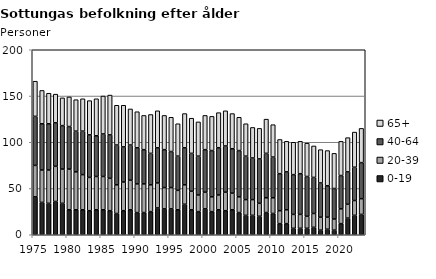
| Category | 0-19 | 20-39 | 40-64 | 65+ |
|---|---|---|---|---|
| 1975.0 | 41 | 34 | 53 | 38 |
| 1976.0 | 35 | 35 | 50 | 36 |
| 1977.0 | 34 | 36 | 50 | 33 |
| 1978.0 | 36 | 38 | 47 | 31 |
| 1979.0 | 34 | 37 | 47 | 30 |
| 1980.0 | 27 | 44 | 46 | 32 |
| 1981.0 | 27 | 41 | 44 | 34 |
| 1982.0 | 27 | 38 | 47 | 35 |
| 1983.0 | 26 | 36 | 46 | 37 |
| 1984.0 | 27 | 36 | 44 | 40 |
| 1985.0 | 27 | 36 | 46 | 41 |
| 1986.0 | 26 | 35 | 47 | 43 |
| 1987.0 | 23 | 31 | 43 | 43 |
| 1988.0 | 26 | 31 | 38 | 45 |
| 1989.0 | 27 | 32 | 38 | 39 |
| 1990.0 | 24 | 31 | 39 | 39 |
| 1991.0 | 24 | 31 | 37 | 37 |
| 1992.0 | 25 | 29 | 34 | 42 |
| 1993.0 | 29 | 27 | 38 | 40 |
| 1994.0 | 28 | 23 | 41 | 37 |
| 1995.0 | 28 | 23 | 39 | 37 |
| 1996.0 | 27 | 21 | 37 | 35 |
| 1997.0 | 33 | 21 | 40 | 37 |
| 1998.0 | 27 | 20 | 41 | 38 |
| 1999.0 | 25 | 18 | 42 | 37 |
| 2000.0 | 28 | 18 | 46 | 37 |
| 2001.0 | 25 | 16 | 50 | 37 |
| 2002.0 | 27 | 16 | 51 | 38 |
| 2003.0 | 26 | 20 | 50 | 38 |
| 2004.0 | 27 | 18 | 48 | 38 |
| 2005.0 | 24 | 17 | 50 | 36 |
| 2006.0 | 21 | 17 | 47 | 35 |
| 2007.0 | 21 | 17 | 45 | 33 |
| 2008.0 | 20 | 14 | 48 | 33 |
| 2009.0 | 24 | 16 | 48 | 37 |
| 2010.0 | 23 | 17 | 44 | 35 |
| 2011.0 | 12 | 14 | 40 | 37 |
| 2012.0 | 12 | 15 | 41 | 33 |
| 2013.0 | 7 | 15 | 43 | 35 |
| 2014.0 | 7 | 15 | 44 | 35 |
| 2015.0 | 7 | 13 | 43 | 36 |
| 2016.0 | 8 | 15 | 39 | 34 |
| 2017.0 | 5 | 14 | 37 | 36 |
| 2018.0 | 6 | 13 | 34 | 38 |
| 2019.0 | 5 | 12 | 33 | 38 |
| 2020.0 | 12 | 16 | 36 | 37 |
| 2021.0 | 18 | 15 | 35 | 37 |
| 2022.0 | 21 | 16 | 36 | 38 |
| 2023.0 | 22 | 17 | 39 | 37 |